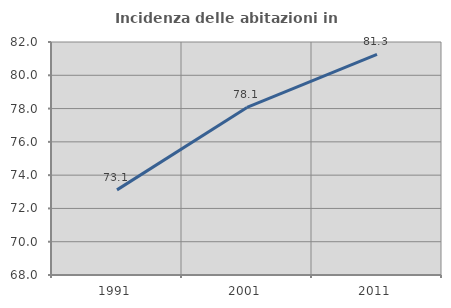
| Category | Incidenza delle abitazioni in proprietà  |
|---|---|
| 1991.0 | 73.116 |
| 2001.0 | 78.07 |
| 2011.0 | 81.25 |